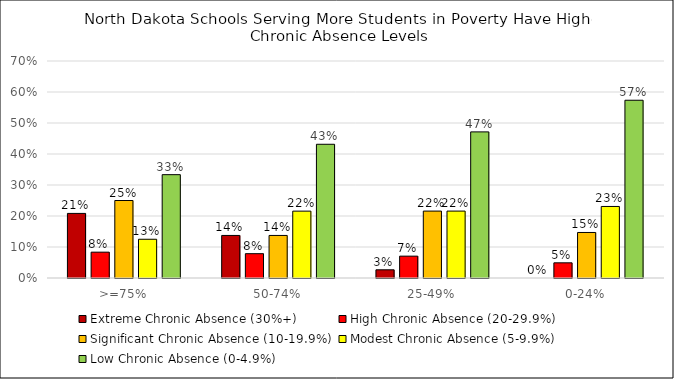
| Category | Extreme Chronic Absence (30%+) | High Chronic Absence (20-29.9%) | Significant Chronic Absence (10-19.9%) | Modest Chronic Absence (5-9.9%) | Low Chronic Absence (0-4.9%) |
|---|---|---|---|---|---|
| >=75% | 0.208 | 0.083 | 0.25 | 0.125 | 0.333 |
| 50-74% | 0.137 | 0.078 | 0.137 | 0.216 | 0.431 |
| 25-49% | 0.026 | 0.07 | 0.216 | 0.216 | 0.471 |
| 0-24% | 0 | 0.049 | 0.147 | 0.231 | 0.573 |